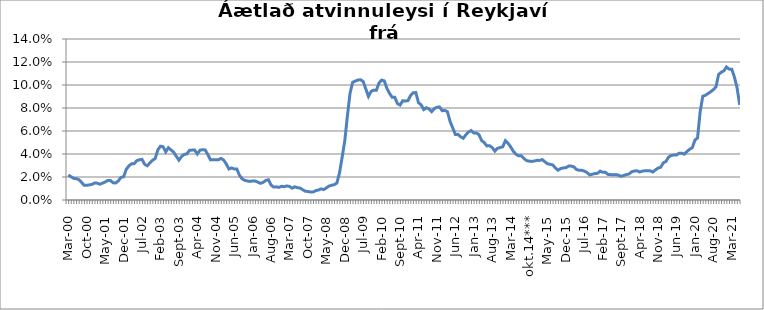
| Category | Series 0 |
|---|---|
| mar.00 | 0.022 |
| apr.00 | 0.02 |
| maí.00 | 0.019 |
| jún.00 | 0.019 |
| júl.00 | 0.018 |
| ágú.00 | 0.015 |
| sep.00 | 0.013 |
| okt.00 | 0.013 |
| nóv.00 | 0.013 |
| des.00 | 0.014 |
| jan.01 | 0.015 |
| feb.01 | 0.015 |
| mar.01 | 0.014 |
| apr.01 | 0.015 |
| maí.01 | 0.016 |
| jún.01 | 0.017 |
| júl.01 | 0.017 |
| ágú.01 | 0.015 |
| sep.01 | 0.015 |
| okt.01 | 0.017 |
| nóv.01 | 0.02 |
| des.01 | 0.02 |
| jan.02 | 0.027 |
| feb.02 | 0.03 |
| mar.02 | 0.031 |
| apr.02 | 0.032 |
| maí.02 | 0.034 |
| jún.02 | 0.035 |
| júl.02 | 0.035 |
| ágú.02 | 0.031 |
| sep.02 | 0.03 |
| okt.02 | 0.032 |
| nóv.02 | 0.035 |
| des.02 | 0.036 |
| jan.03 | 0.044 |
| feb.03 | 0.047 |
| mar.03 | 0.046 |
| apr.03 | 0.042 |
| maí.03 | 0.045 |
| jún.03 | 0.044 |
| júl.03 | 0.042 |
| ágú.03 | 0.038 |
| sep.03 | 0.035 |
| okt.03 | 0.038 |
| nóv.03 | 0.04 |
| des.03 | 0.04 |
| jan.04 | 0.043 |
| feb.04 | 0.043 |
| mar.04 | 0.043 |
| apr.04 | 0.04 |
| maí.04 | 0.043 |
| jún.04 | 0.044 |
| júl.04 | 0.043 |
| ágú.04 | 0.039 |
| sep.04 | 0.035 |
| okt.04 | 0.035 |
| nóv.04 | 0.035 |
| des.04 | 0.035 |
| jan.05 | 0.036 |
| feb.05 | 0.035 |
| mar.05 | 0.031 |
| apr.05 | 0.027 |
| maí.05 | 0.028 |
| jún.05 | 0.027 |
| júl.05 | 0.027 |
| ágú.05 | 0.022 |
| sep.05 | 0.018 |
| okt.05 | 0.017 |
| nóv.05 | 0.017 |
| des.05 | 0.016 |
| jan.06 | 0.017 |
| feb.06 | 0.016 |
| mar.06 | 0.016 |
| apr.06 | 0.014 |
| maí.06 | 0.015 |
| jún.06 | 0.017 |
| júl.06 | 0.018 |
| ágú.06 | 0.013 |
| sep.06 | 0.011 |
| okt.06 | 0.011 |
| nóv.06 | 0.011 |
| des.06 | 0.012 |
| jan.07 | 0.012 |
| feb.07 | 0.012 |
| mar.07 | 0.012 |
| apr.07 | 0.01 |
| maí.07 | 0.011 |
| jún.07 | 0.011 |
| júl.07 | 0.01 |
| ágú.07 | 0.009 |
| sep.07 | 0.008 |
| okt.07 | 0.007 |
| nóv.07 | 0.007 |
| des.07 | 0.007 |
| jan.08 | 0.008 |
| feb.08 | 0.009 |
| mar.08 | 0.01 |
| apr.08 | 0.009 |
| maí.08 | 0.01 |
| jún.08 | 0.012 |
| júl.08 | 0.013 |
| ágú.08 | 0.013 |
| sep.08 | 0.015 |
| okt.08 | 0.024 |
| nóv.08 | 0.037 |
| des.08 | 0.051 |
| jan.09 | 0.073 |
| feb.09 | 0.093 |
| mar.09 | 0.102 |
| apr.09 | 0.103 |
| maí.09 | 0.104 |
| jún.09 | 0.105 |
| júl.09 | 0.103 |
| ágú.09 | 0.097 |
| sep.09 | 0.09 |
| okt.09 | 0.094 |
| nóv.09 | 0.095 |
| des.09 | 0.095 |
| jan.10 | 0.102 |
| feb.10 | 0.104 |
| mar.10 | 0.104 |
| apr.10 | 0.097 |
| maí.10 | 0.093 |
| jún.10 | 0.089 |
| júl.10 | 0.089 |
| ágú.10 | 0.084 |
| sep.10 | 0.083 |
| okt.10 | 0.086 |
| nóv.10 | 0.086 |
| des.10 | 0.086 |
| jan.11 | 0.091 |
| feb.11 | 0.093 |
| mar.11 | 0.093 |
| apr.11 | 0.085 |
| maí.11 | 0.083 |
| jún.11 | 0.079 |
| júl.11 | 0.08 |
| ágú.11 | 0.079 |
| sep.11 | 0.077 |
| okt.11 | 0.079 |
| nóv.11 | 0.081 |
| des.11 | 0.081 |
| jan.12 | 0.078 |
| feb.12 | 0.078 |
| mar.12 | 0.077 |
| apr.12 | 0.068 |
| maí.12 | 0.063 |
| jún.12 | 0.057 |
| júl.12 | 0.057 |
| ágú.12 | 0.055 |
| sep.12 | 0.054 |
| okt.12 | 0.057 |
| nóv.12 | 0.059 |
| des.12 | 0.06 |
| jan.13 | 0.058 |
| feb.13 | 0.058 |
| mar.13 | 0.057 |
| apr.13 | 0.052 |
| maí.13 | 0.05 |
| jún.13 | 0.047 |
| júl.13 | 0.047 |
| ágú.13 | 0.046 |
| sep.13 | 0.043 |
| okt.13 | 0.045 |
| nóv.13 | 0.046 |
| des.13 | 0.046 |
| jan.14 | 0.052 |
| feb.14 | 0.049 |
| mar.14 | 0.046 |
| apr.14 | 0.042 |
| maí.14 | 0.04 |
| jún.14 | 0.038 |
| júl.14 | 0.038 |
| ágú.14 | 0.036 |
| sep.14 | 0.034 |
| okt.14*** | 0.034 |
| nóv.14*** | 0.034 |
| des.14 | 0.034 |
| jan.15 | 0.034 |
| feb.15 | 0.034 |
| mar.15 | 0.035 |
| apr.15 | 0.033 |
| maí.15 | 0.032 |
| jún.15 | 0.031 |
| júl.15 | 0.03 |
| ágú.15 | 0.028 |
| sep.15 | 0.026 |
| okt.15 | 0.027 |
| nóv.15 | 0.028 |
| des.15 | 0.028 |
| jan.16 | 0.03 |
| feb.16 | 0.029 |
| mar.16 | 0.029 |
| apr.16 | 0.027 |
| maí.16 | 0.026 |
| jún.16 | 0.026 |
| júl.16 | 0.025 |
| ágú.16 | 0.024 |
| sep.16 | 0.022 |
| okt.16 | 0.022 |
| nóv.16 | 0.023 |
| des.16 | 0.023 |
| jan.17 | 0.025 |
| feb.17 | 0.024 |
| mar.17 | 0.024 |
| apr.17 | 0.022 |
| maí.17 | 0.022 |
| jún.17 | 0.022 |
| júl.17 | 0.022 |
| ágú.17 | 0.022 |
| sep.17 | 0.021 |
| okt.17 | 0.021 |
| nóv.17 | 0.022 |
| des.17 | 0.023 |
| jan.18 | 0.025 |
| feb.18 | 0.025 |
| mar.18 | 0.025 |
| apr.18 | 0.024 |
| maí.18 | 0.025 |
| jún.18 | 0.025 |
| júl.18 | 0.025 |
| ágú.18 | 0.025 |
| sep.18 | 0.024 |
| okt.18 | 0.026 |
| nóv.18 | 0.028 |
| des.18 | 0.029 |
| jan.19 | 0.032 |
| feb.19 | 0.033 |
| mar.19 | 0.037 |
| apr.19 | 0.039 |
| maí.19 | 0.039 |
| jún.19 | 0.039 |
| júl.19 | 0.041 |
| ágú.19 | 0.041 |
| sep.19 | 0.04 |
| okt.19 | 0.042 |
| nóv.19 | 0.044 |
| des.19 | 0.046 |
| jan.20 | 0.052 |
| feb.20 | 0.054 |
| mar.2020 * | 0.077 |
| apr.20 | 0.09 |
| maí.20 | 0.091 |
| jún.20 | 0.093 |
| júl.20 | 0.094 |
| ágú.20 | 0.096 |
| sep.20 | 0.098 |
| okt.20 | 0.109 |
| nóv.20 | 0.111 |
| des.20 | 0.112 |
| jan.21 | 0.116 |
| feb.21 | 0.114 |
| mar.21 | 0.114 |
| apr.21 | 0.107 |
| maí.21 | 0.098 |
| jún.21 | 0.083 |